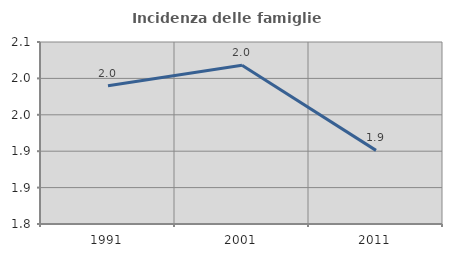
| Category | Incidenza delle famiglie numerose |
|---|---|
| 1991.0 | 1.99 |
| 2001.0 | 2.018 |
| 2011.0 | 1.901 |